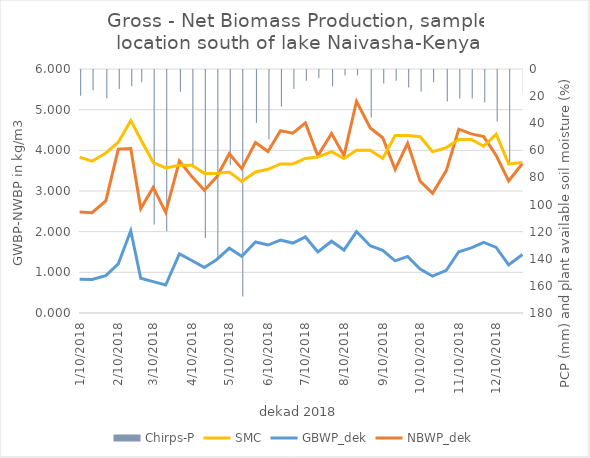
| Category | Chirps-P |
|---|---|
| 1/10/18 | 19 |
| 1/20/18 | 15 |
| 1/31/18 | 21 |
| 2/10/18 | 14 |
| 2/20/18 | 12 |
| 2/28/18 | 9 |
| 3/10/18 | 114 |
| 3/20/18 | 119 |
| 3/31/18 | 16 |
| 4/10/18 | 70 |
| 4/20/18 | 124 |
| 4/30/18 | 139 |
| 5/10/18 | 70 |
| 5/20/18 | 167 |
| 5/31/18 | 39 |
| 6/10/18 | 51 |
| 6/20/18 | 27 |
| 6/30/18 | 14 |
| 7/10/18 | 8 |
| 7/20/18 | 6 |
| 7/31/18 | 12 |
| 8/10/18 | 4 |
| 8/20/18 | 4 |
| 8/31/18 | 35 |
| 9/10/18 | 10 |
| 9/20/18 | 8 |
| 9/30/18 | 13 |
| 10/10/18 | 16 |
| 10/20/18 | 9 |
| 10/31/18 | 23 |
| 11/10/18 | 21 |
| 11/20/18 | 21 |
| 11/30/18 | 24 |
| 12/10/18 | 38 |
| 12/20/18 | 69 |
| 12/31/18 | 17 |